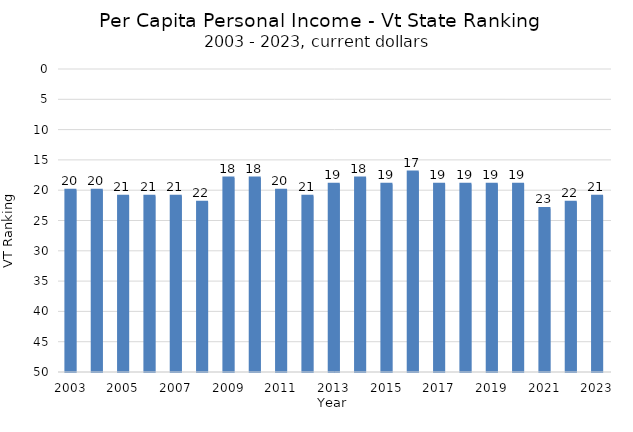
| Category | Vermont |
|---|---|
| 2023 | 21 |
| 2022 | 22 |
| 2021 | 23 |
| 2020 | 19 |
| 2019 | 19 |
| 2018 | 19 |
| 2017 | 19 |
| 2016 | 17 |
| 2015 | 19 |
| 2014 | 18 |
| 2013 | 19 |
| 2012 | 21 |
| 2011 | 20 |
| 2010 | 18 |
| 2009 | 18 |
| 2008 | 22 |
| 2007 | 21 |
| 2006 | 21 |
| 2005 | 21 |
| 2004 | 20 |
| 2003 | 20 |